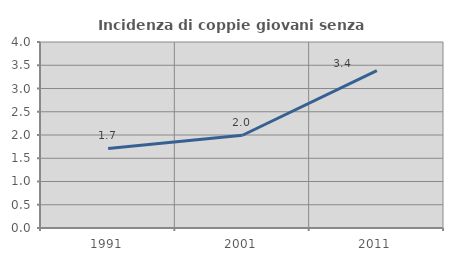
| Category | Incidenza di coppie giovani senza figli |
|---|---|
| 1991.0 | 1.711 |
| 2001.0 | 1.995 |
| 2011.0 | 3.385 |